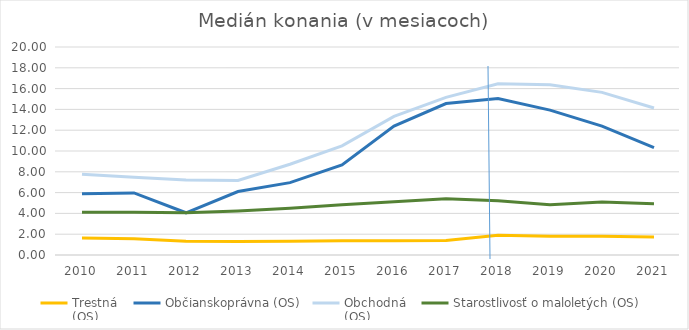
| Category | Trestná
(OS) | Občianskoprávna (OS) | Obchodná
(OS) | Starostlivosť o maloletých (OS) |
|---|---|---|---|---|
| 2010.0 | 1.63 | 5.9 | 7.77 | 4.1 |
| 2011.0 | 1.57 | 5.97 | 7.47 | 4.1 |
| 2012.0 | 1.33 | 4.06 | 7.2 | 4.06 |
| 2013.0 | 1.3 | 6.1 | 7.17 | 4.23 |
| 2014.0 | 1.33 | 6.96 | 8.73 | 4.5 |
| 2015.0 | 1.36 | 8.66 | 10.5 | 4.83 |
| 2016.0 | 1.36 | 12.4 | 13.33 | 5.13 |
| 2017.0 | 1.4 | 14.56 | 15.16 | 5.4 |
| 2018.0 | 1.91 | 15.05 | 16.46 | 5.22 |
| 2019.0 | 1.81 | 13.93 | 16.36 | 4.83 |
| 2020.0 | 1.81 | 12.39 | 15.64 | 5.09 |
| 2021.0 | 1.74 | 10.32 | 14.13 | 4.93 |